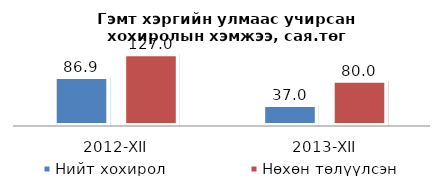
| Category | Нийт хохирол | Нөхөн төлүүлсэн |
|---|---|---|
| 2012-XII | 86.9 | 127 |
| 2013-XII | 37 | 80 |